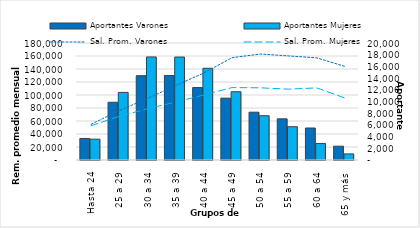
| Category | Aportantes Varones | Aportantes Mujeres |
|---|---|---|
| Hasta 24 | 3679 | 3565 |
| 25 a 29 | 9868 | 11559 |
| 30 a 34 | 14412 | 17618 |
| 35 a 39 | 14437 | 17600 |
| 40 a 44 | 12387 | 15676 |
| 45 a 49 | 10573 | 11671 |
| 50 a 54 | 8174 | 7567 |
| 55 a 59 | 7036 | 5692 |
| 60 a 64 | 5469 | 2828 |
| 65 y más | 2360 | 1041 |